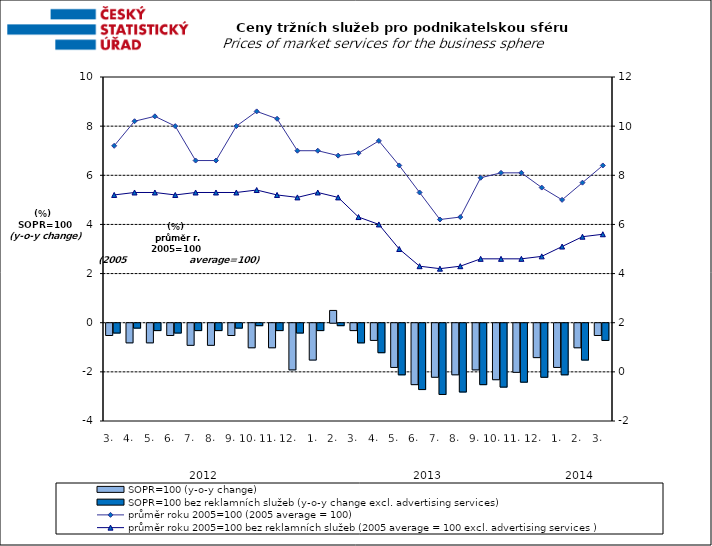
| Category | SOPR=100 (y-o-y change)   | SOPR=100 bez reklamních služeb (y-o-y change excl. advertising services)   |
|---|---|---|
| 0 | -0.5 | -0.4 |
| 1 | -0.8 | -0.2 |
| 2 | -0.8 | -0.3 |
| 3 | -0.5 | -0.4 |
| 4 | -0.9 | -0.3 |
| 5 | -0.9 | -0.3 |
| 6 | -0.5 | -0.2 |
| 7 | -1 | -0.1 |
| 8 | -1 | -0.3 |
| 9 | -1.9 | -0.4 |
| 10 | -1.5 | -0.3 |
| 11 | 0.5 | -0.1 |
| 12 | -0.3 | -0.8 |
| 13 | -0.7 | -1.2 |
| 14 | -1.8 | -2.1 |
| 15 | -2.5 | -2.7 |
| 16 | -2.2 | -2.9 |
| 17 | -2.1 | -2.8 |
| 18 | -1.9 | -2.5 |
| 19 | -2.3 | -2.6 |
| 20 | -2 | -2.4 |
| 21 | -1.4 | -2.2 |
| 22 | -1.8 | -2.1 |
| 23 | -1 | -1.5 |
| 24 | -0.5 | -0.7 |